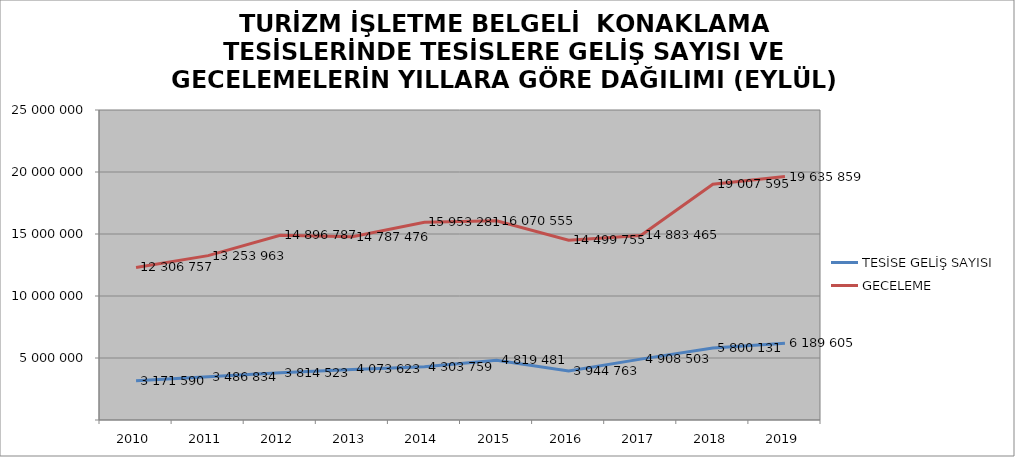
| Category | TESİSE GELİŞ SAYISI | GECELEME |
|---|---|---|
| 2010 | 3171590 | 12306757 |
| 2011 | 3486834 | 13253963 |
| 2012 | 3814523 | 14896787 |
| 2013 | 4073623 | 14787476 |
| 2014 | 4303759 | 15953281 |
| 2015 | 4819481 | 16070555 |
| 2016 | 3944763 | 14499755 |
| 2017 | 4908503 | 14883465 |
| 2018 | 5800131 | 19007595 |
| 2019 | 6189605 | 19635859 |